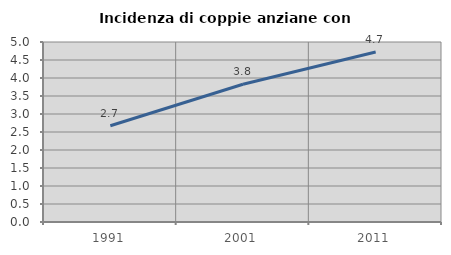
| Category | Incidenza di coppie anziane con figli |
|---|---|
| 1991.0 | 2.675 |
| 2001.0 | 3.826 |
| 2011.0 | 4.722 |